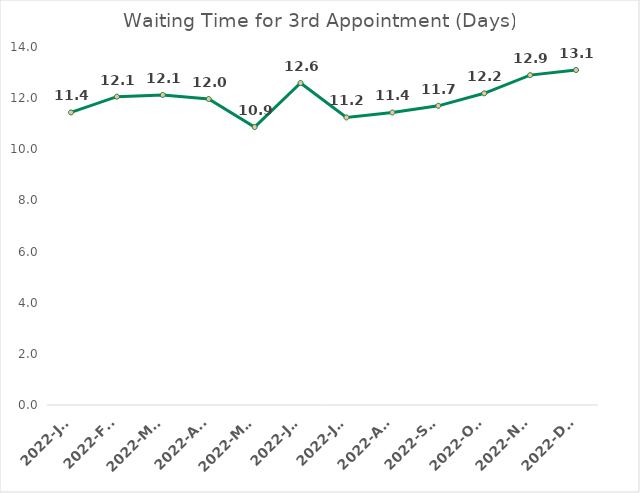
| Category | Waiting Time for 3rd Appointment (Days) |
|---|---|
| 2022-Jan | 11.441 |
| 2022-Feb | 12.058 |
| 2022-Mar | 12.125 |
| 2022-Apr | 11.966 |
| 2022-May | 10.871 |
| 2022-Jun | 12.593 |
| 2022-Jul | 11.245 |
| 2022-Aug | 11.439 |
| 2022-Sep | 11.7 |
| 2022-Oct | 12.189 |
| 2022-Nov | 12.9 |
| 2022-Dec | 13.1 |